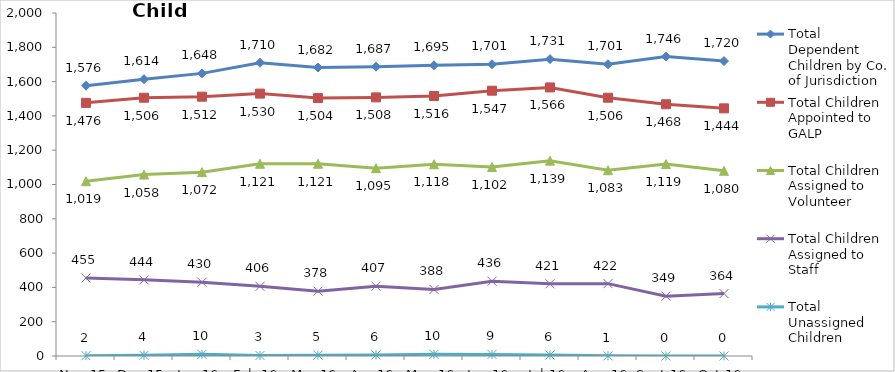
| Category | Total Dependent Children by Co. of Jurisdiction | Total Children Appointed to GALP | Total Children Assigned to Volunteer | Total Children Assigned to Staff | Total Unassigned Children |
|---|---|---|---|---|---|
| Nov-15 | 1576 | 1476 | 1019 | 455 | 2 |
| Dec-15 | 1614 | 1506 | 1058 | 444 | 4 |
| Jan-16 | 1648 | 1512 | 1072 | 430 | 10 |
| Feb-16 | 1710 | 1530 | 1121 | 406 | 3 |
| Mar-16 | 1682 | 1504 | 1121 | 378 | 5 |
| Apr-16 | 1687 | 1508 | 1095 | 407 | 6 |
| May-16 | 1695 | 1516 | 1118 | 388 | 10 |
| Jun-16 | 1701 | 1547 | 1102 | 436 | 9 |
| Jul-16 | 1731 | 1566 | 1139 | 421 | 6 |
| Aug-16 | 1701 | 1506 | 1083 | 422 | 1 |
| Sep-16 | 1746 | 1468 | 1119 | 349 | 0 |
| Oct-16 | 1720 | 1444 | 1080 | 364 | 0 |